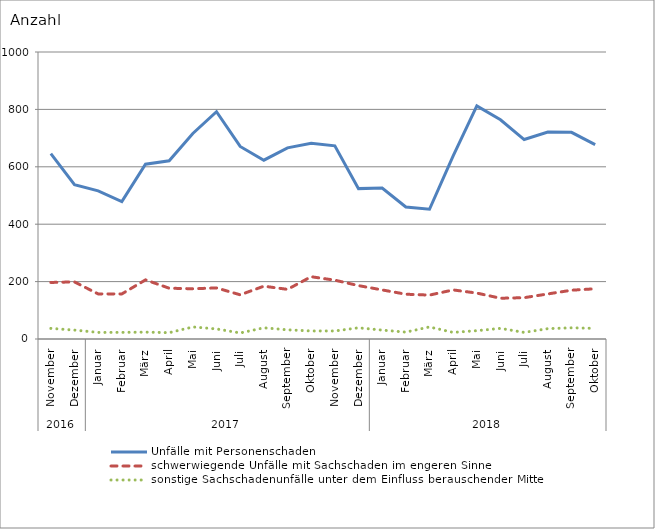
| Category | Unfälle mit Personenschaden | schwerwiegende Unfälle mit Sachschaden im engeren Sinne | sonstige Sachschadenunfälle unter dem Einfluss berauschender Mittel |
|---|---|---|---|
| 0 | 646 | 197 | 37 |
| 1 | 538 | 199 | 31 |
| 2 | 516 | 157 | 23 |
| 3 | 479 | 157 | 23 |
| 4 | 609 | 206 | 24 |
| 5 | 621 | 177 | 22 |
| 6 | 716 | 175 | 42 |
| 7 | 792 | 178 | 35 |
| 8 | 671 | 154 | 21 |
| 9 | 623 | 184 | 39 |
| 10 | 666 | 173 | 32 |
| 11 | 682 | 217 | 28 |
| 12 | 673 | 205 | 28 |
| 13 | 524 | 186 | 39 |
| 14 | 526 | 171 | 31 |
| 15 | 460 | 156 | 24 |
| 16 | 452 | 153 | 42 |
| 17 | 638 | 171 | 23 |
| 18 | 812 | 160 | 29 |
| 19 | 764 | 142 | 37 |
| 20 | 695 | 144 | 23 |
| 21 | 721 | 157 | 36 |
| 22 | 720 | 170 | 39 |
| 23 | 677 | 175 | 37 |